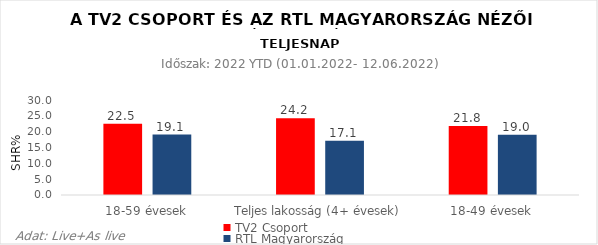
| Category | TV2 Csoport | RTL Magyarország |
|---|---|---|
| 18-59 évesek | 22.5 | 19.1 |
| Teljes lakosság (4+ évesek) | 24.2 | 17.1 |
| 18-49 évesek | 21.8 | 19 |